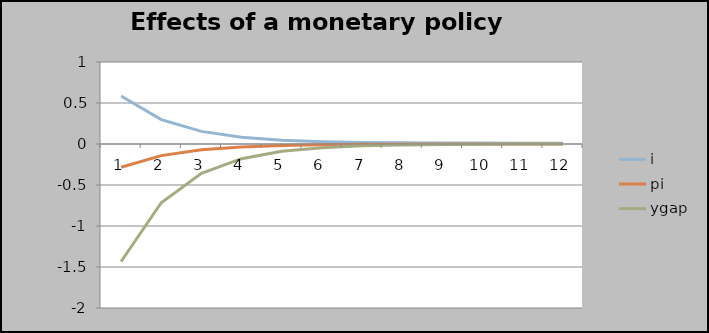
| Category | i | pi | ygap |
|---|---|---|---|
| 0 | 0.585 | -0.284 | -1.433 |
| 1 | 0.297 | -0.142 | -0.716 |
| 2 | 0.154 | -0.071 | -0.358 |
| 3 | 0.082 | -0.035 | -0.179 |
| 4 | 0.046 | -0.018 | -0.09 |
| 5 | 0.028 | -0.009 | -0.045 |
| 6 | 0.019 | -0.004 | -0.022 |
| 7 | 0.015 | -0.002 | -0.011 |
| 8 | 0.012 | -0.001 | -0.006 |
| 9 | 0.011 | -0.001 | -0.003 |
| 10 | 0.011 | 0 | -0.001 |
| 11 | 0.01 | 0 | -0.001 |